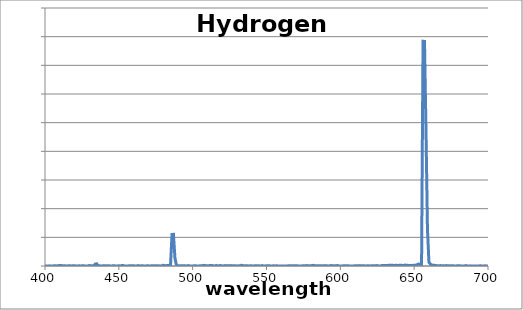
| Category | Series 0 |
|---|---|
| 400.0 | 3.74 |
| 401.0 | 0 |
| 402.0 | 0 |
| 403.0 | 2.65 |
| 404.0 | 0 |
| 405.0 | 0.75 |
| 406.0 | 3.11 |
| 407.0 | 4.42 |
| 408.0 | 1.44 |
| 409.0 | 6.07 |
| 410.0 | 8.71 |
| 411.0 | 7.56 |
| 412.0 | 2.99 |
| 413.0 | 2.62 |
| 414.0 | 2.61 |
| 415.0 | 0 |
| 416.0 | 5.38 |
| 417.0 | 4.01 |
| 418.0 | 1.21 |
| 419.0 | 4.15 |
| 420.0 | 6.11 |
| 421.0 | 0 |
| 422.0 | 0.84 |
| 423.0 | 3.82 |
| 424.0 | 0 |
| 425.0 | 4.9 |
| 426.0 | 3.1 |
| 427.0 | 1.88 |
| 428.0 | 0 |
| 429.0 | 0 |
| 430.0 | 7.85 |
| 431.0 | 5.65 |
| 432.0 | 3.31 |
| 433.0 | 0 |
| 434.0 | 33.22 |
| 435.0 | 38.61 |
| 436.0 | 1.35 |
| 437.0 | 3.12 |
| 438.0 | 0 |
| 439.0 | 3.35 |
| 440.0 | 5.55 |
| 441.0 | 5.62 |
| 442.0 | 0.69 |
| 443.0 | 6.29 |
| 444.0 | 0 |
| 445.0 | 0.89 |
| 446.0 | 3.72 |
| 447.0 | 3.83 |
| 448.0 | 0 |
| 449.0 | 1.46 |
| 450.0 | 4.38 |
| 451.0 | 0 |
| 452.0 | 9.18 |
| 453.0 | 7.89 |
| 454.0 | 0.07 |
| 455.0 | 1.09 |
| 456.0 | 0 |
| 457.0 | 4.33 |
| 458.0 | 6.16 |
| 459.0 | 2.85 |
| 460.0 | 3.07 |
| 461.0 | 1.82 |
| 462.0 | 0 |
| 463.0 | 8.28 |
| 464.0 | 1.07 |
| 465.0 | 2.59 |
| 466.0 | 4.99 |
| 467.0 | 0 |
| 468.0 | 0 |
| 469.0 | 3.52 |
| 470.0 | 2.45 |
| 471.0 | 1.73 |
| 472.0 | 2.73 |
| 473.0 | 5.49 |
| 474.0 | 1.58 |
| 475.0 | 4.28 |
| 476.0 | 3.79 |
| 477.0 | 1.97 |
| 478.0 | 2.49 |
| 479.0 | 0.05 |
| 480.0 | 12.43 |
| 481.0 | 5.87 |
| 482.0 | 4.82 |
| 483.0 | 10.68 |
| 484.0 | 7.11 |
| 485.0 | 9.19 |
| 486.0 | 549.7 |
| 487.0 | 552.76 |
| 488.0 | 136.78 |
| 489.0 | 13.17 |
| 490.0 | 5.65 |
| 491.0 | 1.74 |
| 492.0 | 4.16 |
| 493.0 | 5.43 |
| 494.0 | 5.93 |
| 495.0 | 3.45 |
| 496.0 | 0.3 |
| 497.0 | 8.11 |
| 498.0 | 1.79 |
| 499.0 | 0.16 |
| 500.0 | 0.88 |
| 501.0 | 3.7 |
| 502.0 | 4.82 |
| 503.0 | 0 |
| 504.0 | 0 |
| 505.0 | 4.1 |
| 506.0 | 3.17 |
| 507.0 | 8.65 |
| 508.0 | 11.02 |
| 509.0 | 2.88 |
| 510.0 | 5.05 |
| 511.0 | 5.13 |
| 512.0 | 9.14 |
| 513.0 | 8.1 |
| 514.0 | 3.22 |
| 515.0 | 0.99 |
| 516.0 | 9.98 |
| 517.0 | 0.78 |
| 518.0 | 5.31 |
| 519.0 | 8.4 |
| 520.0 | 0.65 |
| 521.0 | 1.76 |
| 522.0 | 7.8 |
| 523.0 | 2.17 |
| 524.0 | 7.08 |
| 525.0 | 3.38 |
| 526.0 | 6.97 |
| 527.0 | 4.98 |
| 528.0 | 1.91 |
| 529.0 | 4.66 |
| 530.0 | 0 |
| 531.0 | 5.42 |
| 532.0 | 2.85 |
| 533.0 | 12.54 |
| 534.0 | 6.53 |
| 535.0 | 5.59 |
| 536.0 | 3.74 |
| 537.0 | 5.66 |
| 538.0 | 0 |
| 539.0 | 4.11 |
| 540.0 | 2.8 |
| 541.0 | 0 |
| 542.0 | 4.68 |
| 543.0 | 6.26 |
| 544.0 | 3.86 |
| 545.0 | 3.03 |
| 546.0 | 0 |
| 547.0 | 7.36 |
| 548.0 | 1.79 |
| 549.0 | 2.1 |
| 550.0 | 2.37 |
| 551.0 | 6.09 |
| 552.0 | 4.07 |
| 553.0 | 0 |
| 554.0 | 2.1 |
| 555.0 | 2.6 |
| 556.0 | 1.91 |
| 557.0 | 4.15 |
| 558.0 | 0 |
| 559.0 | 0 |
| 560.0 | 2.07 |
| 561.0 | 2.16 |
| 562.0 | 0.12 |
| 563.0 | 0 |
| 564.0 | 2.05 |
| 565.0 | 2.51 |
| 566.0 | 4.66 |
| 567.0 | 1.44 |
| 568.0 | 5.42 |
| 569.0 | 6.02 |
| 570.0 | 5.84 |
| 571.0 | 3.56 |
| 572.0 | 0 |
| 573.0 | 0.5 |
| 574.0 | 2.35 |
| 575.0 | 2.53 |
| 576.0 | 4.18 |
| 577.0 | 7.3 |
| 578.0 | 5.82 |
| 579.0 | 3.95 |
| 580.0 | 2.98 |
| 581.0 | 9.11 |
| 582.0 | 11.41 |
| 583.0 | 2.08 |
| 584.0 | 3.37 |
| 585.0 | 3.47 |
| 586.0 | 5.96 |
| 587.0 | 1.36 |
| 588.0 | 5.46 |
| 589.0 | 5.18 |
| 590.0 | 6.84 |
| 591.0 | 4.08 |
| 592.0 | 0 |
| 593.0 | 5.97 |
| 594.0 | 6.89 |
| 595.0 | 5.5 |
| 596.0 | 2.49 |
| 597.0 | 5.01 |
| 598.0 | 7.97 |
| 599.0 | 2.49 |
| 600.0 | 0 |
| 601.0 | 0 |
| 602.0 | 3.87 |
| 603.0 | 2.24 |
| 604.0 | 2.25 |
| 605.0 | 5.31 |
| 606.0 | 1.44 |
| 607.0 | 0 |
| 608.0 | 1.25 |
| 609.0 | 0.25 |
| 610.0 | 6.24 |
| 611.0 | 3.16 |
| 612.0 | 4.93 |
| 613.0 | 6.65 |
| 614.0 | 4.22 |
| 615.0 | 4.54 |
| 616.0 | 4.86 |
| 617.0 | 0 |
| 618.0 | 3.88 |
| 619.0 | 4.35 |
| 620.0 | 0.53 |
| 621.0 | 4.59 |
| 622.0 | 3.19 |
| 623.0 | 3.66 |
| 624.0 | 4.02 |
| 625.0 | 8.09 |
| 626.0 | 0 |
| 627.0 | 0.12 |
| 628.0 | 7.77 |
| 629.0 | 8.81 |
| 630.0 | 7.21 |
| 631.0 | 10.14 |
| 632.0 | 9.04 |
| 633.0 | 13.23 |
| 634.0 | 12.01 |
| 635.0 | 14.34 |
| 636.0 | 7.77 |
| 637.0 | 10.99 |
| 638.0 | 11.72 |
| 639.0 | 7.37 |
| 640.0 | 14.53 |
| 641.0 | 13.3 |
| 642.0 | 10.22 |
| 643.0 | 10.96 |
| 644.0 | 16.27 |
| 645.0 | 11.51 |
| 646.0 | 10.86 |
| 647.0 | 7.14 |
| 648.0 | 11.09 |
| 649.0 | 9.75 |
| 650.0 | 13.98 |
| 651.0 | 11.94 |
| 652.0 | 23 |
| 653.0 | 34.38 |
| 654.0 | 29.58 |
| 655.0 | 0 |
| 656.0 | 3919.92 |
| 657.0 | 3916.52 |
| 658.0 | 2375.16 |
| 659.0 | 644.77 |
| 660.0 | 63.77 |
| 661.0 | 33.3 |
| 662.0 | 11.84 |
| 663.0 | 16.04 |
| 664.0 | 8.33 |
| 665.0 | 6.69 |
| 666.0 | 6.12 |
| 667.0 | 5.75 |
| 668.0 | 6.73 |
| 669.0 | 5.22 |
| 670.0 | 5.06 |
| 671.0 | 4.11 |
| 672.0 | 7.16 |
| 673.0 | 2.46 |
| 674.0 | 2.95 |
| 675.0 | 1.88 |
| 676.0 | 5.04 |
| 677.0 | 1.65 |
| 678.0 | 1.49 |
| 679.0 | 2.8 |
| 680.0 | 3.65 |
| 681.0 | 2.95 |
| 682.0 | 1.21 |
| 683.0 | 1.96 |
| 684.0 | 0 |
| 685.0 | 7.37 |
| 686.0 | 1.77 |
| 687.0 | 0 |
| 688.0 | 2.74 |
| 689.0 | 0 |
| 690.0 | 0 |
| 691.0 | 0 |
| 692.0 | 1.61 |
| 693.0 | 0 |
| 694.0 | 2.14 |
| 695.0 | 3.27 |
| 696.0 | 0.54 |
| 697.0 | 0 |
| 698.0 | 4.08 |
| 699.0 | 0 |
| 700.0 | 3.6 |